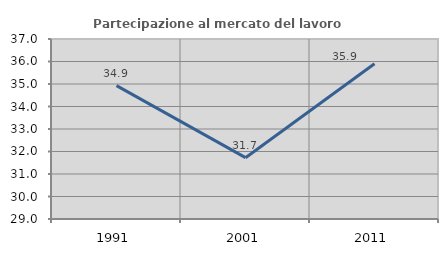
| Category | Partecipazione al mercato del lavoro  femminile |
|---|---|
| 1991.0 | 34.926 |
| 2001.0 | 31.726 |
| 2011.0 | 35.896 |